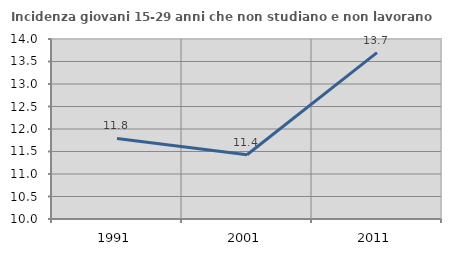
| Category | Incidenza giovani 15-29 anni che non studiano e non lavorano  |
|---|---|
| 1991.0 | 11.789 |
| 2001.0 | 11.429 |
| 2011.0 | 13.699 |